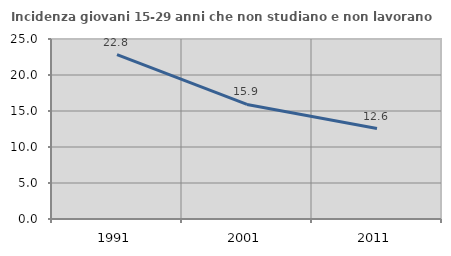
| Category | Incidenza giovani 15-29 anni che non studiano e non lavorano  |
|---|---|
| 1991.0 | 22.837 |
| 2001.0 | 15.915 |
| 2011.0 | 12.557 |